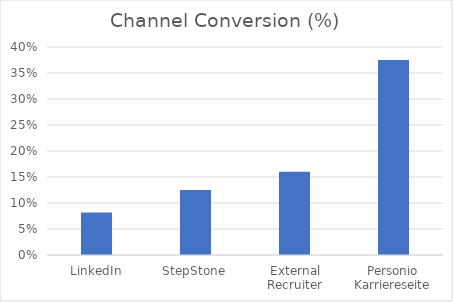
| Category | Channel Conversion (%) |
|---|---|
| LinkedIn | 0.082 |
| StepStone | 0.125 |
| External Recruiter | 0.16 |
| Personio Karriereseite | 0.375 |